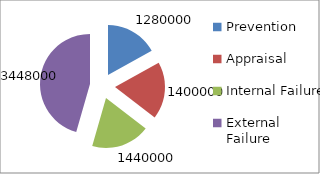
| Category | Series 0 | Series 1 |
|---|---|---|
| Prevention | 1280000 | 1280000 |
| Appraisal | 1400000 | 1400000 |
| Internal Failure | 1440000 | 1440000 |
| External Failure | 3448000 | 3448000 |